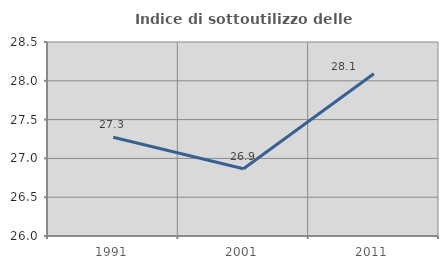
| Category | Indice di sottoutilizzo delle abitazioni  |
|---|---|
| 1991.0 | 27.273 |
| 2001.0 | 26.866 |
| 2011.0 | 28.09 |